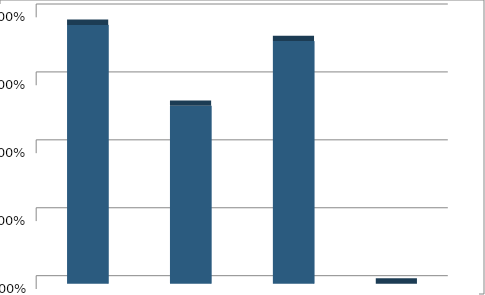
| Category | Series1 |
|---|---|
| Alternative Future #1:  Low Intensity | 0.381 |
| Alternative Future #2:  Medium Intensity | 0.262 |
| Alternative Future #3:  High Intensity | 0.357 |
| None of the Above | 0 |